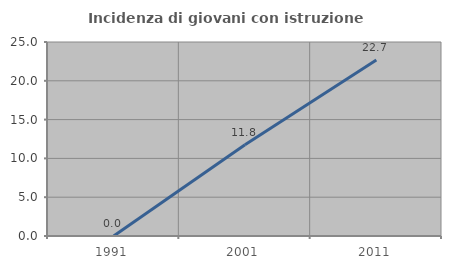
| Category | Incidenza di giovani con istruzione universitaria |
|---|---|
| 1991.0 | 0 |
| 2001.0 | 11.765 |
| 2011.0 | 22.667 |